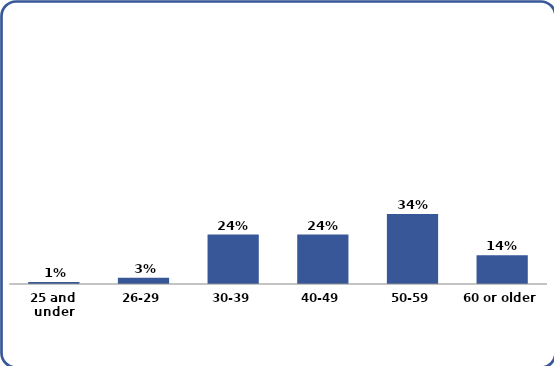
| Category | Series 0 |
|---|---|
| 25 and under | 0.01 |
| 26-29 | 0.03 |
| 30-39 | 0.24 |
| 40-49 | 0.24 |
| 50-59 | 0.34 |
| 60 or older | 0.14 |